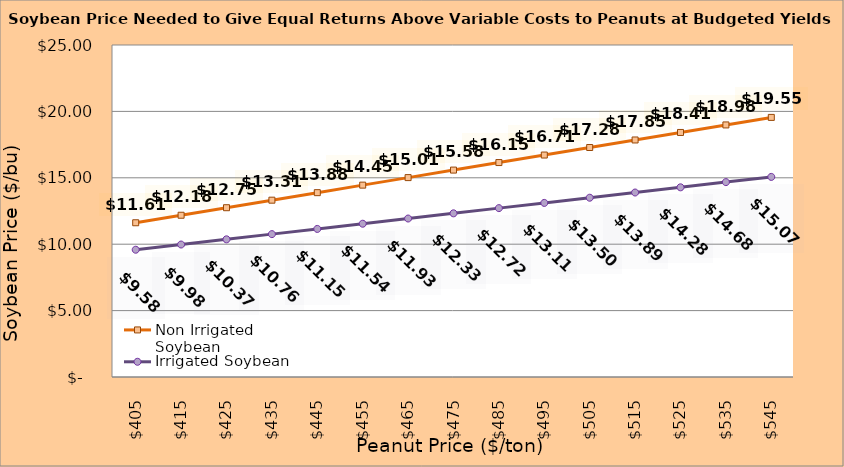
| Category | Non Irrigated Soybean | Irrigated Soybean |
|---|---|---|
| 405.0 | 11.614 | 9.583 |
| 415.0 | 12.181 | 9.975 |
| 425.0 | 12.748 | 10.367 |
| 435.0 | 13.314 | 10.758 |
| 445.0 | 13.881 | 11.15 |
| 455.0 | 14.448 | 11.542 |
| 465.0 | 15.014 | 11.933 |
| 475.0 | 15.581 | 12.325 |
| 485.0 | 16.148 | 12.717 |
| 495.0 | 16.714 | 13.108 |
| 505.0 | 17.281 | 13.5 |
| 515.0 | 17.848 | 13.892 |
| 525.0 | 18.414 | 14.283 |
| 535.0 | 18.981 | 14.675 |
| 545.0 | 19.548 | 15.067 |